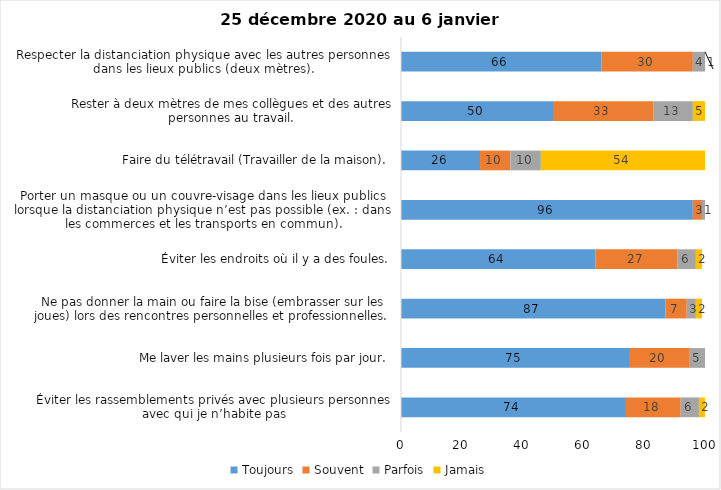
| Category | Toujours | Souvent | Parfois | Jamais |
|---|---|---|---|---|
| Éviter les rassemblements privés avec plusieurs personnes avec qui je n’habite pas | 74 | 18 | 6 | 2 |
| Me laver les mains plusieurs fois par jour. | 75 | 20 | 5 | 0 |
| Ne pas donner la main ou faire la bise (embrasser sur les joues) lors des rencontres personnelles et professionnelles. | 87 | 7 | 3 | 2 |
| Éviter les endroits où il y a des foules. | 64 | 27 | 6 | 2 |
| Porter un masque ou un couvre-visage dans les lieux publics lorsque la distanciation physique n’est pas possible (ex. : dans les commerces et les transports en commun). | 96 | 3 | 1 | 0 |
| Faire du télétravail (Travailler de la maison). | 26 | 10 | 10 | 54 |
| Rester à deux mètres de mes collègues et des autres personnes au travail. | 50 | 33 | 13 | 5 |
| Respecter la distanciation physique avec les autres personnes dans les lieux publics (deux mètres). | 66 | 30 | 4 | 1 |